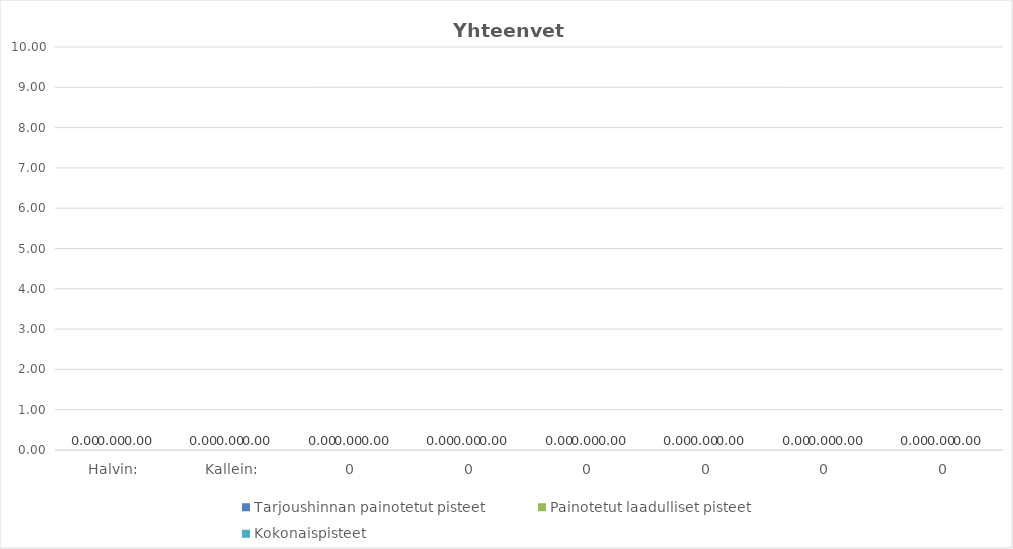
| Category | Tarjoushinnan painotetut pisteet | Painotetut laadulliset pisteet | Kokonaispisteet |
|---|---|---|---|
| Halvin: | 0 | 0 | 0 |
| Kallein: | 0 | 0 | 0 |
| 0 | 0 | 0 | 0 |
| 0 | 0 | 0 | 0 |
| 0 | 0 | 0 | 0 |
| 0 | 0 | 0 | 0 |
| 0 | 0 | 0 | 0 |
| 0 | 0 | 0 | 0 |